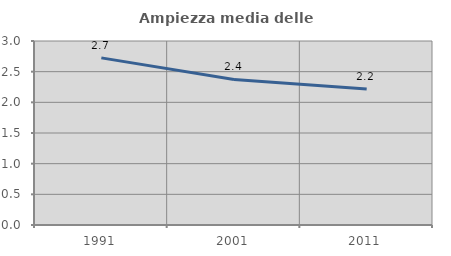
| Category | Ampiezza media delle famiglie |
|---|---|
| 1991.0 | 2.725 |
| 2001.0 | 2.373 |
| 2011.0 | 2.216 |